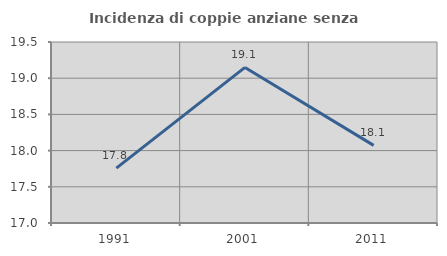
| Category | Incidenza di coppie anziane senza figli  |
|---|---|
| 1991.0 | 17.757 |
| 2001.0 | 19.149 |
| 2011.0 | 18.072 |